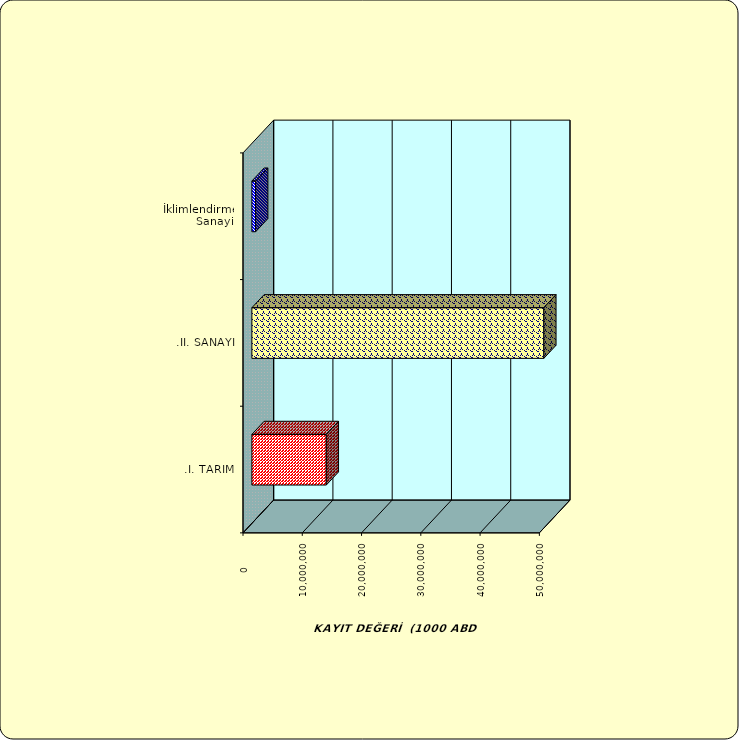
| Category | Series 0 |
|---|---|
| .I. TARIM | 12554277.887 |
| .II. SANAYİ | 49252642.54 |
|  İklimlendirme Sanayii | 635584.178 |